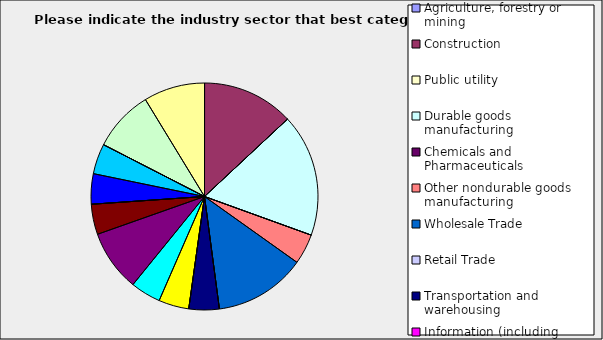
| Category | Series 0 |
|---|---|
| Agriculture, forestry or mining | 0 |
| Construction | 0.13 |
| Public utility | 0 |
| Durable goods manufacturing | 0.174 |
| Chemicals and Pharmaceuticals | 0 |
| Other nondurable goods manufacturing | 0.043 |
| Wholesale Trade | 0.13 |
| Retail Trade | 0 |
| Transportation and warehousing | 0.043 |
| Information (including broadcasting and telecommunication) | 0 |
| Finance and Insurance | 0.043 |
| Real Estate | 0.043 |
| Professional, scientific and technical services | 0.087 |
| Consulting | 0.043 |
| Administrative and office services (including waste management) | 0 |
| Education | 0.043 |
| Health Care and social services | 0.043 |
| Arts, entertainment and recreation | 0 |
| Accommodation and food services | 0.087 |
| Other | 0.087 |